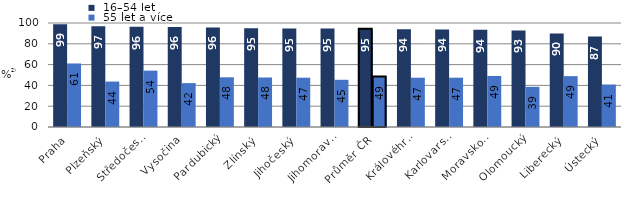
| Category |  16–54 let |  55 let a více |
|---|---|---|
|   Praha | 98.7 | 61.1 |
|   Plzeňský | 96.8 | 43.7 |
|   Středočeský | 96.4 | 54.2 |
|   Vysočina | 96.1 | 42.2 |
|   Pardubický | 95.7 | 47.8 |
|   Zlínský | 95 | 47.6 |
|   Jihočeský | 94.7 | 47.4 |
|   Jihomoravský | 94.7 | 45.4 |
| Průměr ČR | 94.5 | 48.5 |
|   Královéhradecký | 93.9 | 47.4 |
|   Karlovarský | 93.8 | 47.4 |
|   Moravskoslezský | 93.5 | 49.1 |
|   Olomoucký | 92.8 | 38.6 |
|   Liberecký | 90 | 48.9 |
|   Ústecký | 87 | 40.8 |